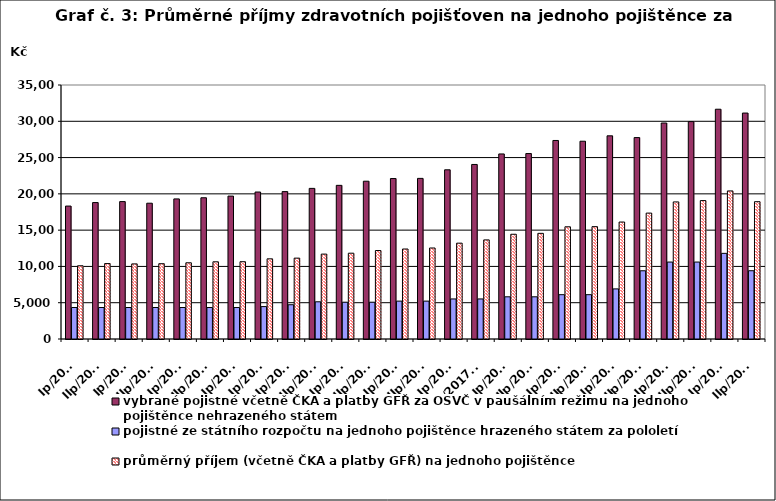
| Category | vybrané pojistné včetně ČKA a platby GFŘ za OSVČ v paušálním režimu na jednoho pojištěnce nehrazeného státem  | pojistné ze státního rozpočtu na jednoho pojištěnce hrazeného státem za pololetí  | průměrný příjem (včetně ČKA a platby GFŘ) na jednoho pojištěnce |
|---|---|---|---|
| Ip/2010 | 18316.395 | 4338.634 | 10089.544 |
| IIp/2010 | 18798.341 | 4338.533 | 10393.495 |
| Ip/2011 | 18931.802 | 4338.662 | 10348.648 |
| IIp/2011 | 18711.05 | 4338.663 | 10374.592 |
| Ip/2012 | 19304.352 | 4339.03 | 10502.618 |
| IIp/2012 | 19463.128 | 4338.186 | 10637.262 |
| Ip/2013 | 19693.633 | 4338.024 | 10650.373 |
| Ip/2013 | 20253.156 | 4465.678 | 11046.225 |
| Ip/2014 | 20309.098 | 4722.015 | 11143.067 |
| IIp/2014 | 20755.41 | 5128.5 | 11697.748 |
| Ip/2015 | 21171.193 | 5070.005 | 11823.721 |
| IIp/2015 | 21743.057 | 5070 | 12191.59 |
| Ip/2016 | 22111.163 | 5220 | 12401.46 |
| IIp/2016 | 22131.662 | 5220 | 12540.463 |
| Ip/2017 | 23315.23 | 5520 | 13206.67 |
| IIp/2017 *) | 24050.41 | 5520 | 13655.028 |
| Ip/2018 | 25500.62 | 5814 | 14432.484 |
| IIp/2018 | 25553.728 | 5814 | 14558.839 |
| Ip/2019 | 27356.44 | 6108 | 15462.71 |
| IIp/2019 | 27253.16 | 6108 | 15481.6 |
| Ip/2020 | 27996.831 | 6904.268 | 16116.02 |
| IIp/2020 | 27753.573 | 9402 | 17347.288 |
| Ip/2021 | 29762.245 | 10602 | 18889.899 |
| IIp/2021 | 29956.28 | 10602 | 19073.561 |
| Ip/2022 | 31661.03 | 11802 | 20403.061 |
| IIp/2022 | 31133.679 | 9407.582 | 18919.943 |